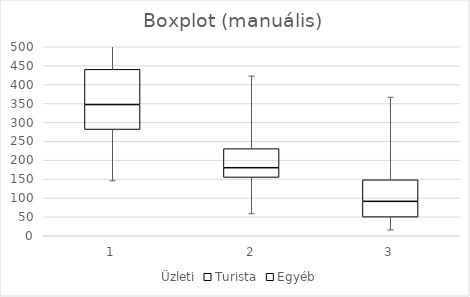
| Category | Üzleti | Turista | Egyéb |
|---|---|---|---|
| 0 | 281 | 66 | 93.25 |
| 1 | 154.25 | 25.75 | 50.5 |
| 2 | 49.25 | 41.75 | 57 |